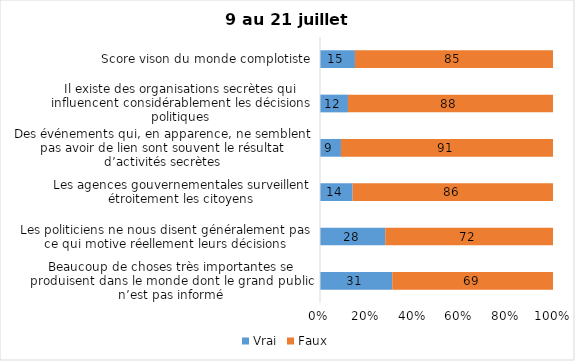
| Category | Vrai | Faux |
|---|---|---|
| Beaucoup de choses très importantes se produisent dans le monde dont le grand public n’est pas informé | 31 | 69 |
| Les politiciens ne nous disent généralement pas ce qui motive réellement leurs décisions | 28 | 72 |
| Les agences gouvernementales surveillent étroitement les citoyens | 14 | 86 |
| Des événements qui, en apparence, ne semblent pas avoir de lien sont souvent le résultat d’activités secrètes | 9 | 91 |
| Il existe des organisations secrètes qui influencent considérablement les décisions politiques | 12 | 88 |
| Score vison du monde complotiste | 15 | 85 |